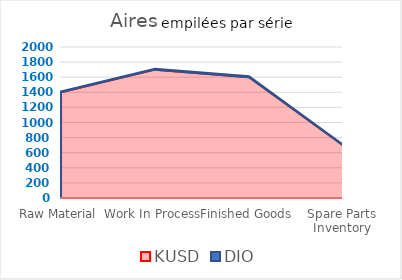
| Category | KUSD | DIO |
|---|---|---|
| Raw Material | 1400 | 10.461 |
| Work In Process | 1700 | 12.809 |
| Finished Goods | 1600 | 11.693 |
| Spare Parts Inventory | 700 | 5.012 |